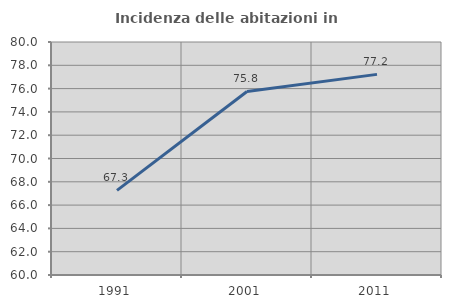
| Category | Incidenza delle abitazioni in proprietà  |
|---|---|
| 1991.0 | 67.267 |
| 2001.0 | 75.751 |
| 2011.0 | 77.221 |